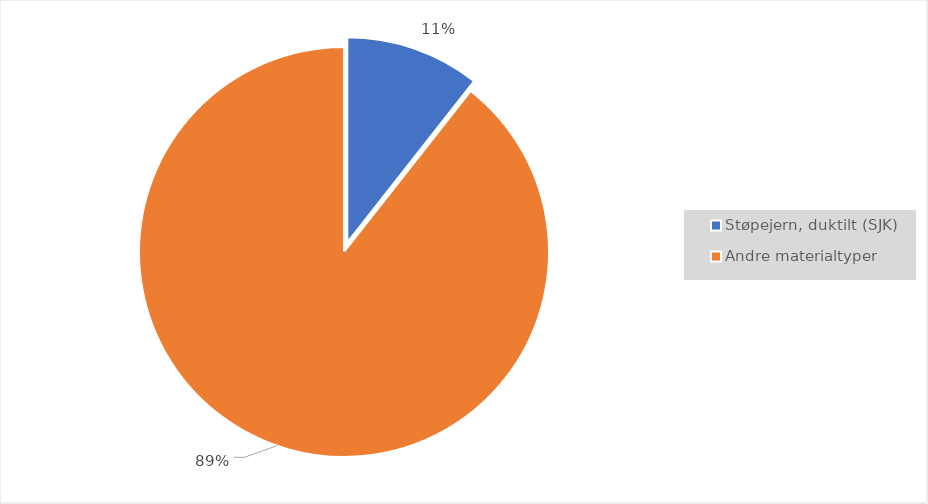
| Category | Series 0 |
|---|---|
| Støpejern, duktilt (SJK) | 0.106 |
| Andre materialtyper | 0.894 |